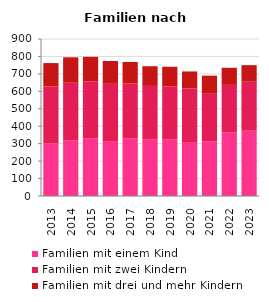
| Category | Familien mit einem Kind | Familien mit zwei Kindern | Familien mit drei und mehr Kindern |
|---|---|---|---|
| 2013.0 | 302 | 326 | 134 |
| 2014.0 | 320 | 329 | 146 |
| 2015.0 | 329 | 329 | 140 |
| 2016.0 | 311 | 332 | 131 |
| 2017.0 | 329 | 317 | 122 |
| 2018.0 | 326 | 305 | 113 |
| 2019.0 | 323 | 305 | 113 |
| 2020.0 | 305 | 311 | 98 |
| 2021.0 | 314 | 272 | 104 |
| 2022.0 | 365 | 272 | 98 |
| 2023.0 | 374 | 281 | 95 |